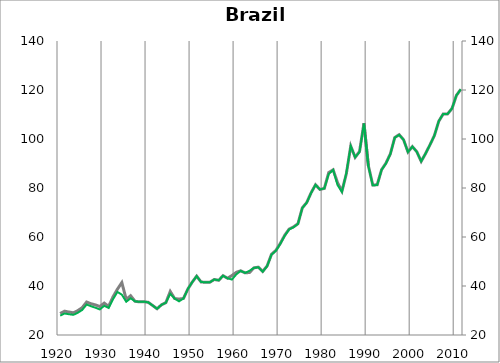
| Category | Bra17 |
|---|---|
| 1920.0 | 28.768 |
| 1921.0 | 29.723 |
| 1922.0 | 29.371 |
| 1923.0 | 29.069 |
| 1924.0 | 29.954 |
| 1925.0 | 31.159 |
| 1926.0 | 33.458 |
| 1927.0 | 32.759 |
| 1928.0 | 32.29 |
| 1929.0 | 31.611 |
| 1930.0 | 33.021 |
| 1931.0 | 31.689 |
| 1932.0 | 35.557 |
| 1933.0 | 38.709 |
| 1934.0 | 41.395 |
| 1935.0 | 34.537 |
| 1936.0 | 36.029 |
| 1937.0 | 33.749 |
| 1938.0 | 33.534 |
| 1939.0 | 33.592 |
| 1940.0 | 33.338 |
| 1941.0 | 32.039 |
| 1942.0 | 30.715 |
| 1943.0 | 32.317 |
| 1944.0 | 33.197 |
| 1945.0 | 37.771 |
| 1946.0 | 34.865 |
| 1947.0 | 34.673 |
| 1948.0 | 34.918 |
| 1949.0 | 38.776 |
| 1950.0 | 41.614 |
| 1951.0 | 44.021 |
| 1952.0 | 41.65 |
| 1953.0 | 41.492 |
| 1954.0 | 41.539 |
| 1955.0 | 42.664 |
| 1956.0 | 42.334 |
| 1957.0 | 44.202 |
| 1958.0 | 43.174 |
| 1959.0 | 44.237 |
| 1960.0 | 45.58 |
| 1961.0 | 46.204 |
| 1962.0 | 45.364 |
| 1963.0 | 45.507 |
| 1964.0 | 47.414 |
| 1965.0 | 47.688 |
| 1966.0 | 45.922 |
| 1967.0 | 48.172 |
| 1968.0 | 52.938 |
| 1969.0 | 54.549 |
| 1970.0 | 57.393 |
| 1971.0 | 60.7 |
| 1972.0 | 63.237 |
| 1973.0 | 64.127 |
| 1974.0 | 65.41 |
| 1975.0 | 71.908 |
| 1976.0 | 74.062 |
| 1977.0 | 78.066 |
| 1978.0 | 81.33 |
| 1979.0 | 79.397 |
| 1980.0 | 79.849 |
| 1981.0 | 86.296 |
| 1982.0 | 87.421 |
| 1983.0 | 82.162 |
| 1984.0 | 78.707 |
| 1985.0 | 85.809 |
| 1986.0 | 97.105 |
| 1987.0 | 92.532 |
| 1988.0 | 94.919 |
| 1989.0 | 106.47 |
| 1990.0 | 89.148 |
| 1991.0 | 81.247 |
| 1992.0 | 81.297 |
| 1993.0 | 87.439 |
| 1994.0 | 90.156 |
| 1995.0 | 93.957 |
| 1996.0 | 100.604 |
| 1997.0 | 101.77 |
| 1998.0 | 99.695 |
| 1999.0 | 94.697 |
| 2000.0 | 96.895 |
| 2001.0 | 94.808 |
| 2002.0 | 90.884 |
| 2003.0 | 94.068 |
| 2004.0 | 97.634 |
| 2005.0 | 101.398 |
| 2006.0 | 107.273 |
| 2007.0 | 110.212 |
| 2008.0 | 110.236 |
| 2009.0 | 112.444 |
| 2010.0 | 117.784 |
| 2011.0 | 120.285 |